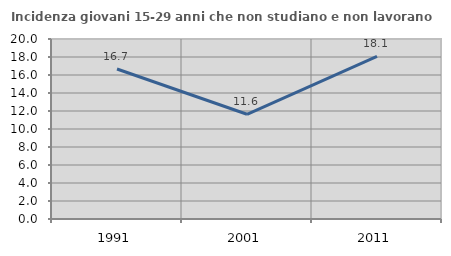
| Category | Incidenza giovani 15-29 anni che non studiano e non lavorano  |
|---|---|
| 1991.0 | 16.667 |
| 2001.0 | 11.635 |
| 2011.0 | 18.069 |